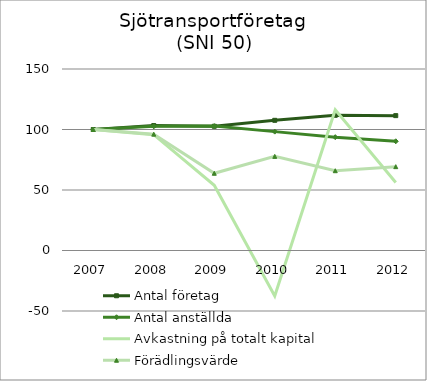
| Category | Antal företag | Antal anställda | Avkastning på totalt kapital | Förädlingsvärde |
|---|---|---|---|---|
| 2007.0 | 100 | 100 | 100 | 100 |
| 2008.0 | 103.276 | 102.624 | 95.718 | 96.145 |
| 2009.0 | 102.672 | 102.812 | 53.941 | 63.827 |
| 2010.0 | 107.586 | 98.246 | -37.637 | 77.78 |
| 2011.0 | 111.724 | 93.672 | 116.32 | 65.942 |
| 2012.0 | 111.466 | 90.268 | 56.227 | 69.302 |